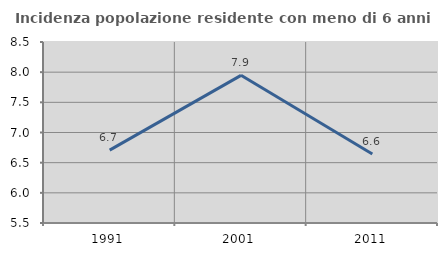
| Category | Incidenza popolazione residente con meno di 6 anni |
|---|---|
| 1991.0 | 6.708 |
| 2001.0 | 7.948 |
| 2011.0 | 6.643 |